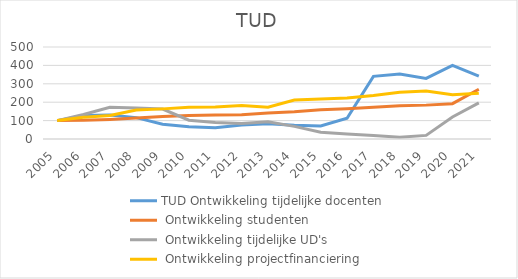
| Category | TUD |
|---|---|
| 2005.0 | 100 |
| 2006.0 | 118.128 |
| 2007.0 | 128.042 |
| 2008.0 | 157.016 |
| 2009.0 | 163.723 |
| 2010.0 | 171.983 |
| 2011.0 | 173.371 |
| 2012.0 | 181.386 |
| 2013.0 | 173.145 |
| 2014.0 | 212.136 |
| 2015.0 | 217.374 |
| 2016.0 | 223.483 |
| 2017.0 | 236.703 |
| 2018.0 | 254.002 |
| 2019.0 | 260.883 |
| 2020.0 | 239.955 |
| 2021.0 | 249.266 |